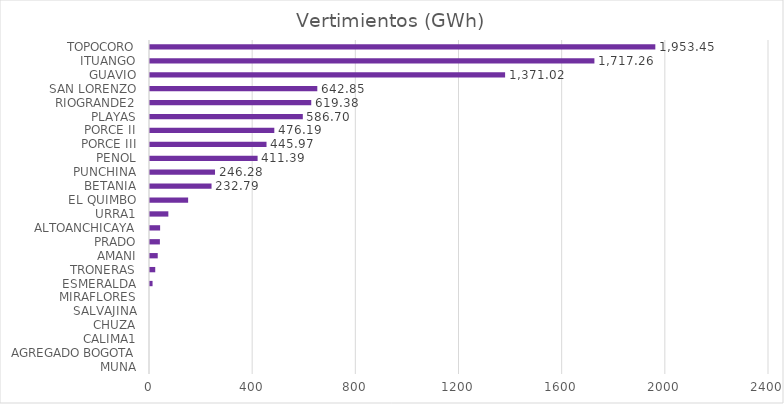
| Category | Vertimientos (GWh) |
|---|---|
| MUNA | 0 |
| AGREGADO BOGOTA | 0 |
| CALIMA1 | 0 |
| CHUZA | 0 |
| SALVAJINA | 0 |
| MIRAFLORES | 0 |
| ESMERALDA | 4.087 |
| TRONERAS | 14.483 |
| AMANI | 24.167 |
| PRADO | 32.542 |
| ALTOANCHICAYA | 33.401 |
| URRA1 | 65.31 |
| EL QUIMBO | 142.005 |
| BETANIA | 232.793 |
| PUNCHINA | 246.285 |
| PENOL | 411.391 |
| PORCE III | 445.971 |
| PORCE II | 476.193 |
| PLAYAS | 586.696 |
| RIOGRANDE2 | 619.383 |
| SAN LORENZO | 642.852 |
| GUAVIO | 1371.02 |
| ITUANGO | 1717.263 |
| TOPOCORO | 1953.446 |